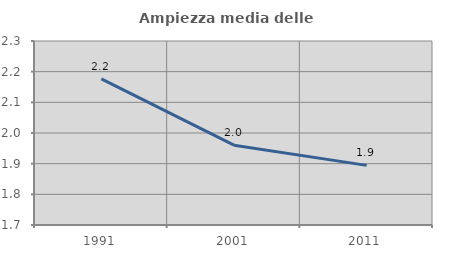
| Category | Ampiezza media delle famiglie |
|---|---|
| 1991.0 | 2.176 |
| 2001.0 | 1.96 |
| 2011.0 | 1.894 |